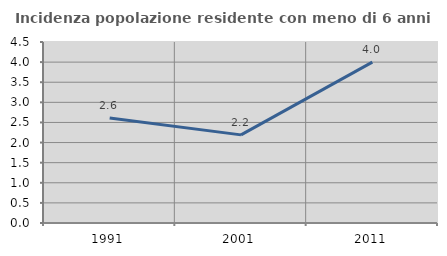
| Category | Incidenza popolazione residente con meno di 6 anni |
|---|---|
| 1991.0 | 2.612 |
| 2001.0 | 2.191 |
| 2011.0 | 4 |